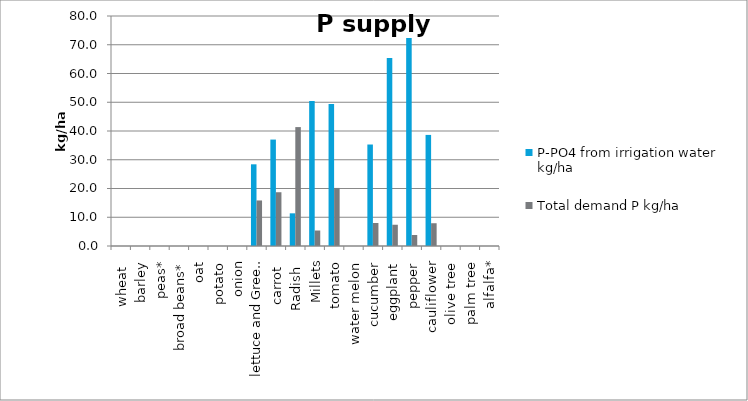
| Category | P-PO4 from irrigation water kg/ha | Total demand P kg/ha |
|---|---|---|
| wheat  | 0 | 0 |
| barley | 0 | 0 |
| peas* | 0 | 0 |
| broad beans* | 0 | 0 |
| oat | 0 | 0 |
| potato | 0 | 0 |
| onion | 0 | 0 |
| lettuce and Green-Leaf Crops | 28.414 | 15.84 |
| carrot  | 37.018 | 18.7 |
| Radish  | 11.365 | 41.36 |
| Millets | 50.393 | 5.386 |
| tomato | 49.42 | 20.196 |
| water melon | 0 | 0 |
| cucumber | 35.299 | 8.008 |
| eggplant | 65.425 | 7.392 |
| pepper | 72.369 | 3.824 |
| cauliflower | 38.639 | 7.92 |
| olive tree | 0 | 0 |
| palm tree | 0 | 0 |
| alfalfa* | 0 | 0 |